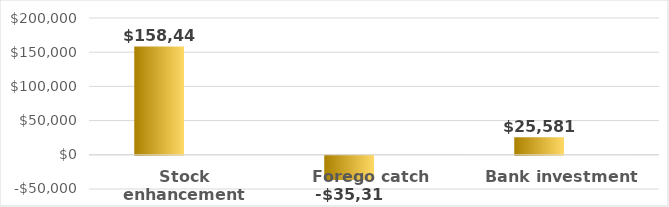
| Category | Series 0 | Series 1 |
|---|---|---|
| Stock enhancement | 158443.889 |  |
| Forego catch | -35314.405 |  |
| Bank investment | 25580.918 |  |